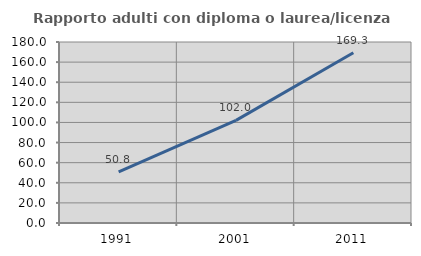
| Category | Rapporto adulti con diploma o laurea/licenza media  |
|---|---|
| 1991.0 | 50.763 |
| 2001.0 | 102.041 |
| 2011.0 | 169.328 |